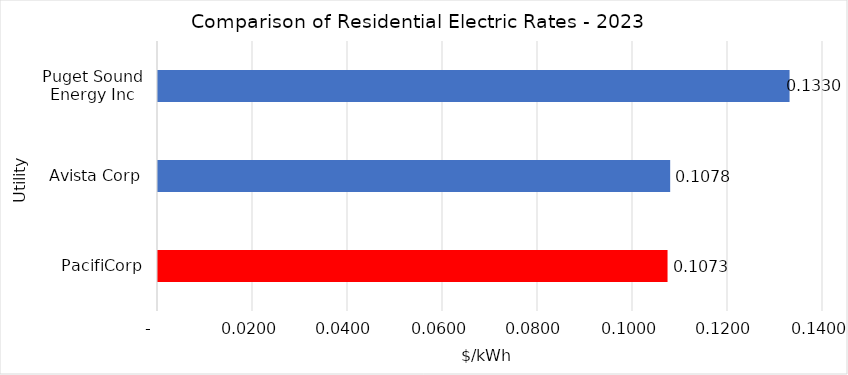
| Category | Series 0 |
|---|---|
| PacifiCorp | 0.107 |
| Avista Corp | 0.108 |
| Puget Sound Energy Inc | 0.133 |